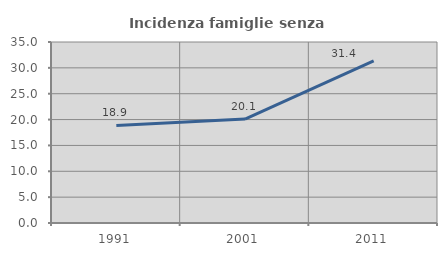
| Category | Incidenza famiglie senza nuclei |
|---|---|
| 1991.0 | 18.873 |
| 2001.0 | 20.101 |
| 2011.0 | 31.373 |